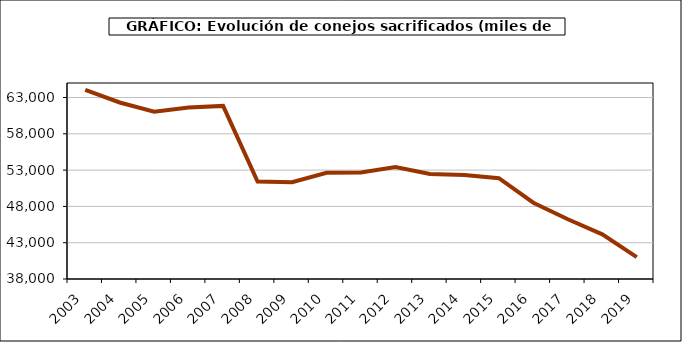
| Category | Peso canal |
|---|---|
| 2003.0 | 64060.308 |
| 2004.0 | 62317.056 |
| 2005.0 | 61048.849 |
| 2006.0 | 61617.92 |
| 2007.0 | 61847.888 |
| 2008.0 | 51435.256 |
| 2009.0 | 51329.996 |
| 2010.0 | 52633.291 |
| 2011.0 | 52667.903 |
| 2012.0 | 53411.014 |
| 2013.0 | 52470.38 |
| 2014.0 | 52326.841 |
| 2015.0 | 51880.278 |
| 2016.0 | 48506.567 |
| 2017.0 | 46233.799 |
| 2018.0 | 44155.273 |
| 2019.0 | 41005.916 |